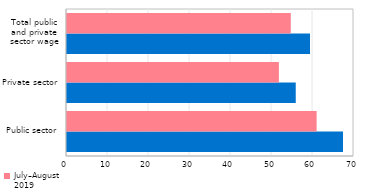
| Category | July–August 2020 | July–August 2019 |
|---|---|---|
| Public sector | 67.318 | 60.884 |
| Private sector | 55.79 | 51.678 |
| Total public
and private
sector wage | 59.271 | 54.579 |